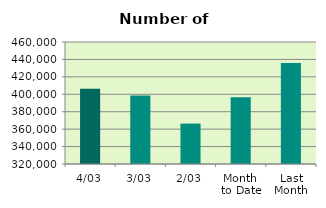
| Category | Series 0 |
|---|---|
| 4/03 | 406446 |
| 3/03 | 398472 |
| 2/03 | 366380 |
| Month 
to Date | 396695 |
| Last
Month | 435925.8 |